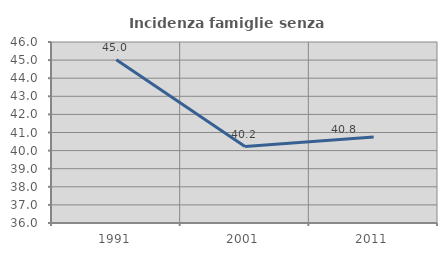
| Category | Incidenza famiglie senza nuclei |
|---|---|
| 1991.0 | 45.013 |
| 2001.0 | 40.223 |
| 2011.0 | 40.751 |